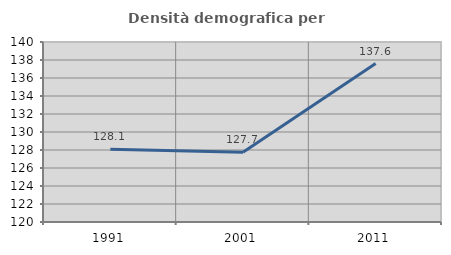
| Category | Densità demografica |
|---|---|
| 1991.0 | 128.077 |
| 2001.0 | 127.742 |
| 2011.0 | 137.604 |